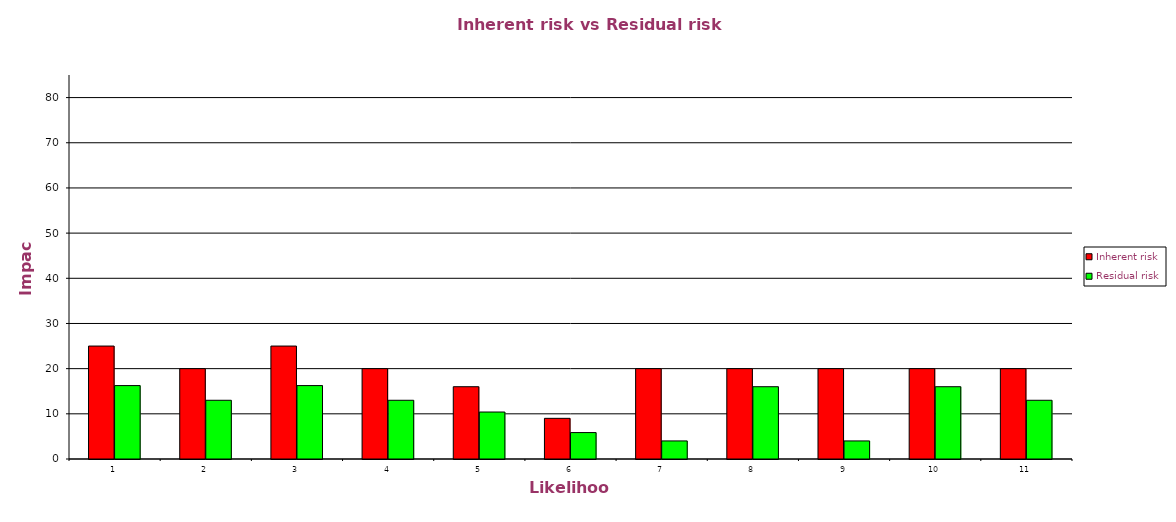
| Category | Inherent risk | Residual risk |
|---|---|---|
| 1.0 | 25 | 16.25 |
| 2.0 | 20 | 13 |
| 3.0 | 25 | 16.25 |
| 4.0 | 20 | 13 |
| 5.0 | 16 | 10.4 |
| 6.0 | 9 | 5.85 |
| 7.0 | 20 | 4 |
| 8.0 | 20 | 16 |
| 9.0 | 20 | 4 |
| 10.0 | 20 | 16 |
| 11.0 | 20 | 13 |